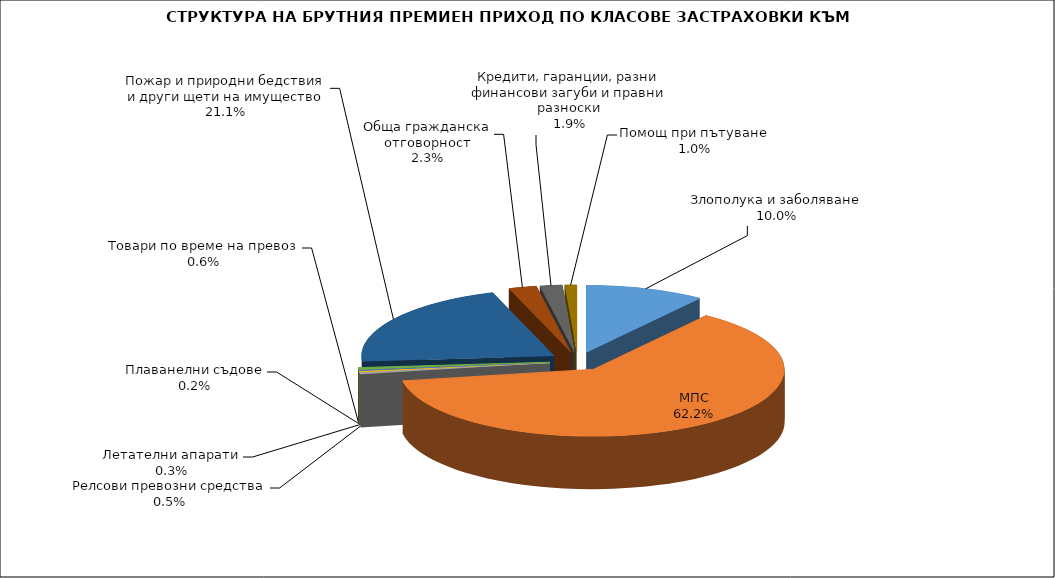
| Category | Злополука и заболяване |
|---|---|
| Злополука и заболяване | 0.1 |
| МПС | 0.622 |
| Релсови превозни средства | 0.005 |
| Летателни апарати | 0.003 |
| Плаванелни съдове | 0.002 |
| Товари по време на превоз | 0.006 |
| Пожар и природни бедствия и други щети на имущество | 0.211 |
| Обща гражданска отговорност | 0.023 |
| Кредити, гаранции, разни финансови загуби и правни разноски | 0.019 |
| Помощ при пътуване | 0.01 |